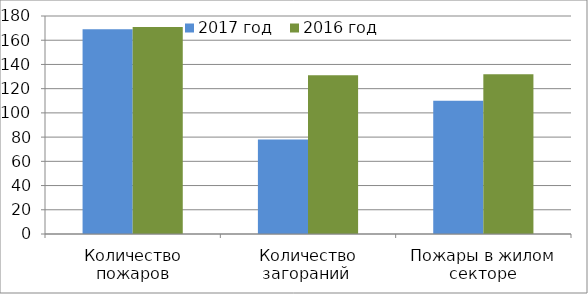
| Category | 2017 год | 2016 год |
|---|---|---|
| Количество пожаров | 169 | 171 |
| Количество загораний  | 78 | 131 |
| Пожары в жилом секторе | 110 | 132 |